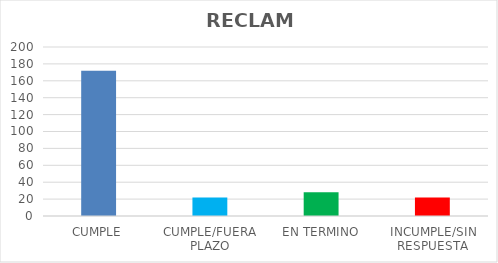
| Category | TOTAL |
|---|---|
| CUMPLE | 172 |
| CUMPLE/FUERA PLAZO | 22 |
| EN TERMINO | 28 |
| INCUMPLE/SIN RESPUESTA | 22 |